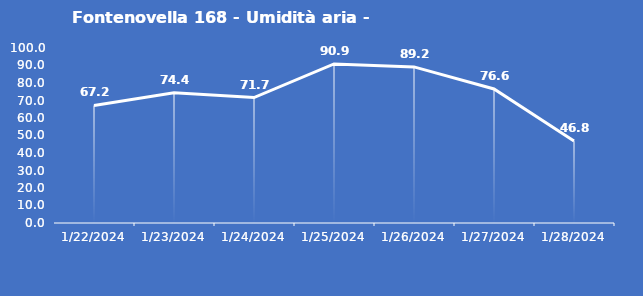
| Category | Fontenovella 168 - Umidità aria - Grezzo (%) |
|---|---|
| 1/22/24 | 67.2 |
| 1/23/24 | 74.4 |
| 1/24/24 | 71.7 |
| 1/25/24 | 90.9 |
| 1/26/24 | 89.2 |
| 1/27/24 | 76.6 |
| 1/28/24 | 46.8 |